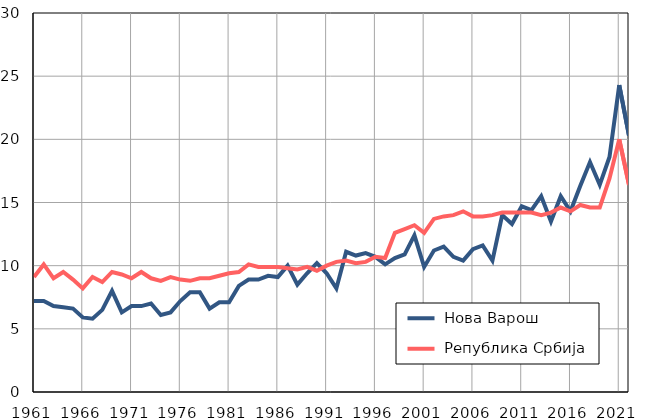
| Category |  Нова Варош |  Република Србија |
|---|---|---|
| 1961.0 | 7.2 | 9.1 |
| 1962.0 | 7.2 | 10.1 |
| 1963.0 | 6.8 | 9 |
| 1964.0 | 6.7 | 9.5 |
| 1965.0 | 6.6 | 8.9 |
| 1966.0 | 5.9 | 8.2 |
| 1967.0 | 5.8 | 9.1 |
| 1968.0 | 6.5 | 8.7 |
| 1969.0 | 8 | 9.5 |
| 1970.0 | 6.3 | 9.3 |
| 1971.0 | 6.8 | 9 |
| 1972.0 | 6.8 | 9.5 |
| 1973.0 | 7 | 9 |
| 1974.0 | 6.1 | 8.8 |
| 1975.0 | 6.3 | 9.1 |
| 1976.0 | 7.2 | 8.9 |
| 1977.0 | 7.9 | 8.8 |
| 1978.0 | 7.9 | 9 |
| 1979.0 | 6.6 | 9 |
| 1980.0 | 7.1 | 9.2 |
| 1981.0 | 7.1 | 9.4 |
| 1982.0 | 8.4 | 9.5 |
| 1983.0 | 8.9 | 10.1 |
| 1984.0 | 8.9 | 9.9 |
| 1985.0 | 9.2 | 9.9 |
| 1986.0 | 9.1 | 9.9 |
| 1987.0 | 10 | 9.8 |
| 1988.0 | 8.5 | 9.7 |
| 1989.0 | 9.4 | 9.9 |
| 1990.0 | 10.2 | 9.6 |
| 1991.0 | 9.4 | 10 |
| 1992.0 | 8.2 | 10.3 |
| 1993.0 | 11.1 | 10.4 |
| 1994.0 | 10.8 | 10.2 |
| 1995.0 | 11 | 10.3 |
| 1996.0 | 10.7 | 10.7 |
| 1997.0 | 10.1 | 10.6 |
| 1998.0 | 10.6 | 12.6 |
| 1999.0 | 10.9 | 12.9 |
| 2000.0 | 12.4 | 13.2 |
| 2001.0 | 9.9 | 12.6 |
| 2002.0 | 11.2 | 13.7 |
| 2003.0 | 11.5 | 13.9 |
| 2004.0 | 10.7 | 14 |
| 2005.0 | 10.4 | 14.3 |
| 2006.0 | 11.3 | 13.9 |
| 2007.0 | 11.6 | 13.9 |
| 2008.0 | 10.4 | 14 |
| 2009.0 | 14 | 14.2 |
| 2010.0 | 13.3 | 14.2 |
| 2011.0 | 14.7 | 14.2 |
| 2012.0 | 14.4 | 14.2 |
| 2013.0 | 15.5 | 14 |
| 2014.0 | 13.5 | 14.2 |
| 2015.0 | 15.5 | 14.6 |
| 2016.0 | 14.3 | 14.3 |
| 2017.0 | 16.3 | 14.8 |
| 2018.0 | 18.2 | 14.6 |
| 2019.0 | 16.4 | 14.6 |
| 2020.0 | 18.6 | 16.9 |
| 2021.0 | 24.3 | 20 |
| 2022.0 | 20.3 | 16.4 |